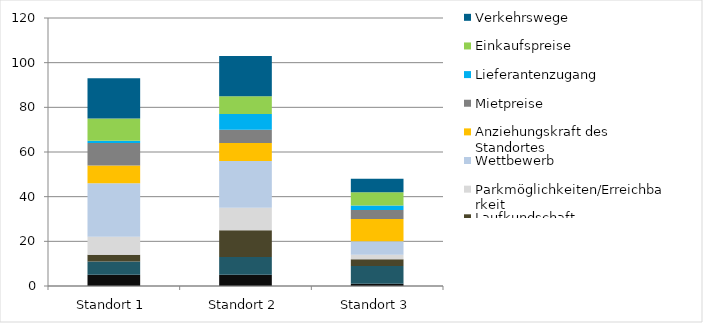
| Category | Einzugsgebiet | Kaufkraft | Laufkundschaft | Parkmöglichkeiten/Erreichbarkeit | Wettbewerb | Anziehungskraft des Standortes | Mietpreise | Lieferantenzugang | Einkaufspreise | Verkehrswege |
|---|---|---|---|---|---|---|---|---|---|---|
| Standort 1 | 5 | 6 | 3 | 8 | 24 | 8 | 10 | 1 | 10 | 18 |
| Standort 2 | 5 | 8 | 12 | 10 | 21 | 8 | 6 | 7 | 8 | 18 |
| Standort 3 | 1 | 8 | 3 | 2 | 6 | 10 | 4 | 2 | 6 | 6 |